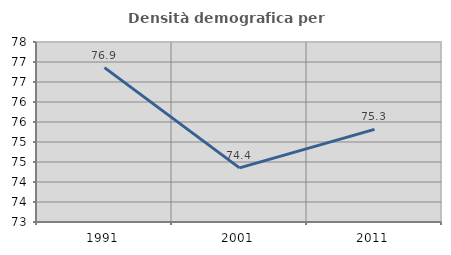
| Category | Densità demografica |
|---|---|
| 1991.0 | 76.859 |
| 2001.0 | 74.353 |
| 2011.0 | 75.317 |